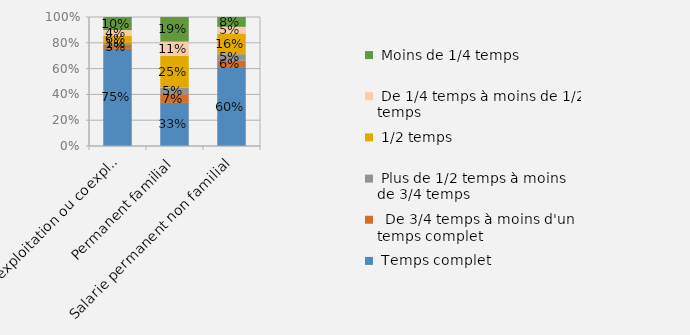
| Category |  Temps complet |   De 3/4 temps à moins d'un temps complet |  Plus de 1/2 temps à moins de 3/4 temps |  1/2 temps |  De 1/4 temps à moins de 1/2 temps |  Moins de 1/4 temps |
|---|---|---|---|---|---|---|
| Chef d'exploitation ou coexploitant | 0.753 | 0.031 | 0.015 | 0.057 | 0.043 | 0.101 |
| Permanent familial | 0.334 | 0.067 | 0.05 | 0.247 | 0.111 | 0.191 |
| Salarie permanent non familial | 0.605 | 0.056 | 0.051 | 0.16 | 0.051 | 0.076 |